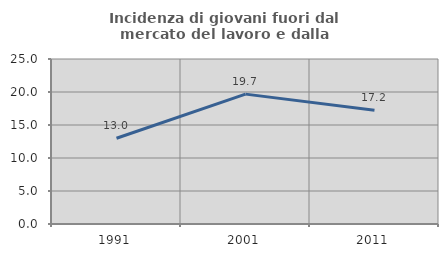
| Category | Incidenza di giovani fuori dal mercato del lavoro e dalla formazione  |
|---|---|
| 1991.0 | 12.995 |
| 2001.0 | 19.678 |
| 2011.0 | 17.224 |